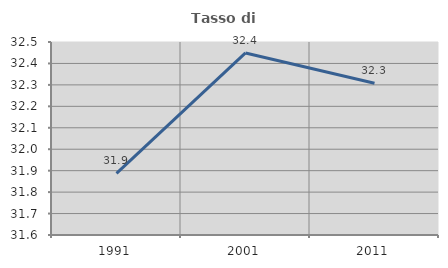
| Category | Tasso di occupazione   |
|---|---|
| 1991.0 | 31.887 |
| 2001.0 | 32.449 |
| 2011.0 | 32.308 |